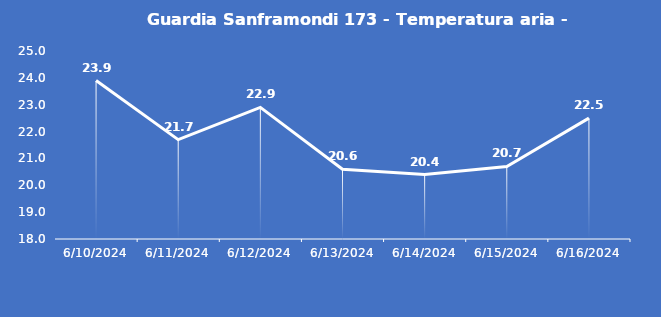
| Category | Guardia Sanframondi 173 - Temperatura aria - Grezzo (°C) |
|---|---|
| 6/10/24 | 23.9 |
| 6/11/24 | 21.7 |
| 6/12/24 | 22.9 |
| 6/13/24 | 20.6 |
| 6/14/24 | 20.4 |
| 6/15/24 | 20.7 |
| 6/16/24 | 22.5 |